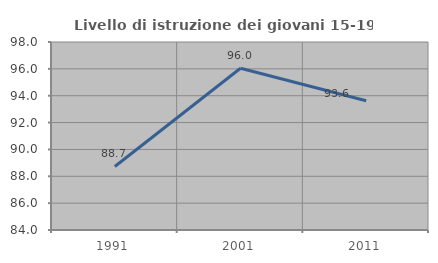
| Category | Livello di istruzione dei giovani 15-19 anni |
|---|---|
| 1991.0 | 88.732 |
| 2001.0 | 96.047 |
| 2011.0 | 93.626 |